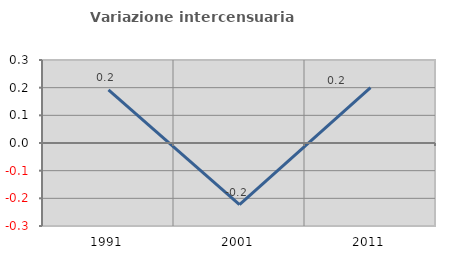
| Category | Variazione intercensuaria annua |
|---|---|
| 1991.0 | 0.192 |
| 2001.0 | -0.223 |
| 2011.0 | 0.2 |